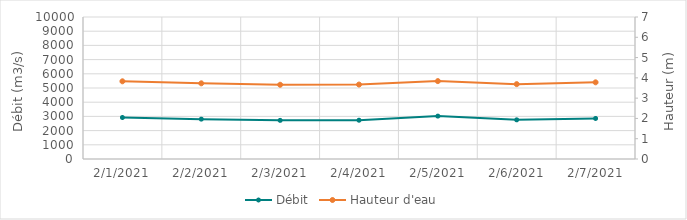
| Category | Débit |
|---|---|
| 2/2/21 | 2811.14 |
| 2/1/21 | 2899.56 |
| 1/31/21 | 3311.16 |
| 1/30/21 | 3377.06 |
| 1/29/21 | 3238.57 |
| 1/28/21 | 3079.58 |
| 1/27/21 | 2608.16 |